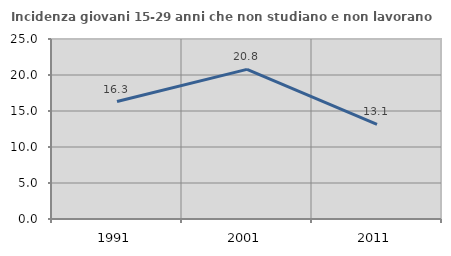
| Category | Incidenza giovani 15-29 anni che non studiano e non lavorano  |
|---|---|
| 1991.0 | 16.315 |
| 2001.0 | 20.787 |
| 2011.0 | 13.139 |